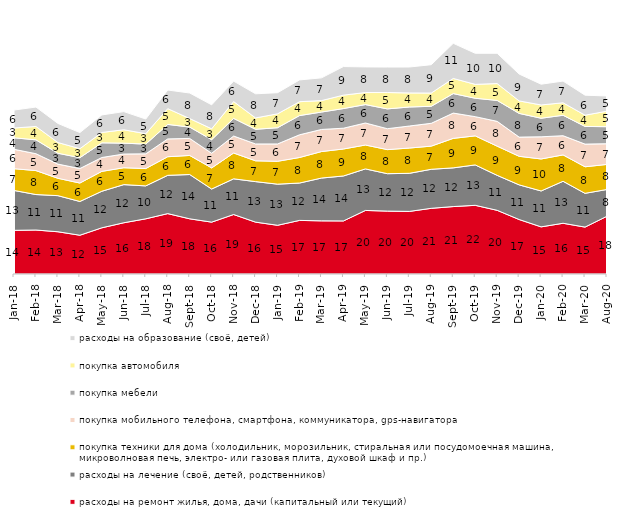
| Category | расходы на ремонт жилья, дома, дачи (капитальный или текущий) | расходы на лечение (своё, детей, родственников) | покупка техники для дома (холодильник, морозильник, стиральная или посудомоечная машина, микроволновая печь, электро- или газовая плита, духовой шкаф и пр.) | покупка мобильного телефона, смартфона, коммуникатора, gps-навигатора | покупка мебели | покупка автомобиля | расходы на образование (своё, детей) |
|---|---|---|---|---|---|---|---|
| 2018-01-01 | 13.85 | 12.65 | 6.9 | 6.15 | 3.65 | 3.1 | 5.7 |
| 2018-02-01 | 13.95 | 11.25 | 7.6 | 5.35 | 4.4 | 4.25 | 6.15 |
| 2018-03-01 | 13.4 | 11.45 | 5.5 | 4.5 | 3.45 | 3.4 | 6.05 |
| 2018-04-01 | 12.3 | 10.7 | 5.85 | 4.6 | 3.45 | 2.85 | 5.1 |
| 2018-05-01 | 14.65 | 11.6 | 6.3 | 4.4 | 4.65 | 3.3 | 5.55 |
| 2018-06-01 | 16.25 | 12.1 | 5.35 | 4.35 | 3.45 | 4.25 | 5.75 |
| 2018-07-01 | 17.5 | 10.45 | 5.5 | 4.65 | 3.1 | 3.3 | 4.65 |
| 2018-08-01 | 19.15 | 12.15 | 5.9 | 5.65 | 4.6 | 5 | 5.9 |
| 2018-09-01 | 17.5 | 14.05 | 6.05 | 5.4 | 3.6 | 2.7 | 8.1 |
| 2018-10-01 | 16.45 | 10.5 | 6.7 | 4.65 | 4.3 | 3.45 | 7.6 |
| 2018-11-01 | 18.862 | 11.327 | 8.184 | 5.389 | 5.589 | 5.339 | 6.487 |
| 2018-12-01 | 16.45 | 12.85 | 6.6 | 5.35 | 4.65 | 3.6 | 7.65 |
| 2019-01-01 | 15.45 | 13.05 | 7.25 | 5.5 | 5.15 | 4.4 | 6.7 |
| 2019-02-01 | 17 | 11.85 | 8.1 | 7.2 | 6.1 | 4.4 | 6.9 |
| 2019-03-01 | 16.857 | 13.575 | 8.404 | 7.011 | 5.52 | 3.63 | 7.21 |
| 2019-04-01 | 16.832 | 14.257 | 8.564 | 6.584 | 6.238 | 4.257 | 9.059 |
| 2019-05-01 | 20.158 | 13.175 | 7.578 | 6.984 | 5.844 | 3.814 | 8.123 |
| 2019-06-01 | 19.95 | 11.87 | 7.631 | 6.633 | 6.284 | 5.187 | 8.08 |
| 2019-07-01 | 19.851 | 12.079 | 8.02 | 6.98 | 6.04 | 4.455 | 8.218 |
| 2019-08-01 | 20.829 | 12.388 | 7.343 | 7.243 | 5.395 | 4.196 | 8.991 |
| 2019-09-01 | 21.386 | 12.277 | 9.356 | 8.02 | 6.188 | 4.802 | 11.139 |
| 2019-10-01 | 21.782 | 12.822 | 9.208 | 6.089 | 5.842 | 4.406 | 9.851 |
| 2019-11-01 | 20.198 | 11.089 | 9.257 | 7.871 | 6.634 | 5.347 | 9.604 |
| 2019-12-01 | 17.277 | 10.99 | 9.059 | 6.089 | 7.525 | 3.96 | 8.515 |
| 2020-01-01 | 14.95 | 11.386 | 10.149 | 7.03 | 5.891 | 4.208 | 6.584 |
| 2020-02-01 | 16.089 | 13.317 | 8.366 | 6.089 | 6.485 | 3.96 | 6.881 |
| 2020-03-01 | 14.874 | 10.709 | 8.428 | 7.189 | 5.602 | 3.57 | 6.346 |
| 2020-08-01 | 18.322 | 8.491 | 7.944 | 6.554 | 5.412 | 4.916 | 4.816 |